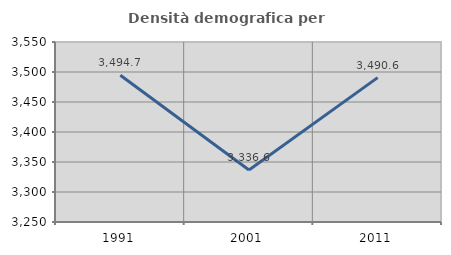
| Category | Densità demografica |
|---|---|
| 1991.0 | 3494.7 |
| 2001.0 | 3336.619 |
| 2011.0 | 3490.631 |